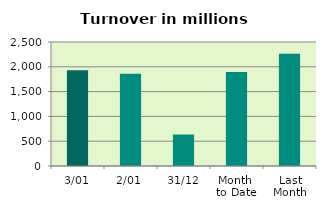
| Category | Series 0 |
|---|---|
| 3/01 | 1932.469 |
| 2/01 | 1857.708 |
| 31/12 | 634.603 |
| Month 
to Date | 1895.089 |
| Last
Month | 2262.611 |